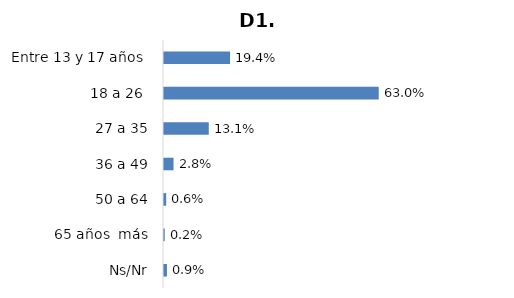
| Category | Series 0 |
|---|---|
| Entre 13 y 17 años  | 0.194 |
| 18 a 26  | 0.63 |
| 27 a 35 | 0.131 |
| 36 a 49 | 0.028 |
| 50 a 64 | 0.006 |
| 65 años  más | 0.002 |
| Ns/Nr | 0.009 |